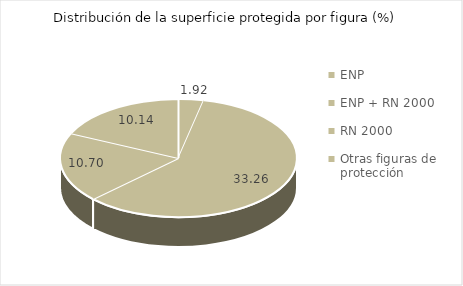
| Category | Protegido |
|---|---|
| ENP | 1.922 |
| ENP + RN 2000 | 33.261 |
| RN 2000 | 10.698 |
| Otras figuras de protección | 10.14 |